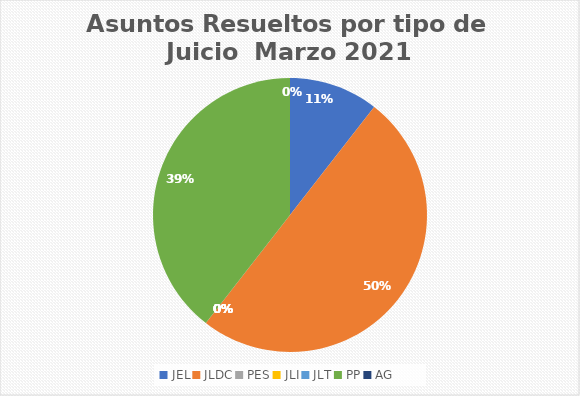
| Category | Asuntos Resueltos por tipo de Juicio  Marzo |
|---|---|
| JEL | 4 |
| JLDC | 19 |
| PES | 0 |
| JLI | 0 |
| JLT | 0 |
| PP | 15 |
| AG | 0 |